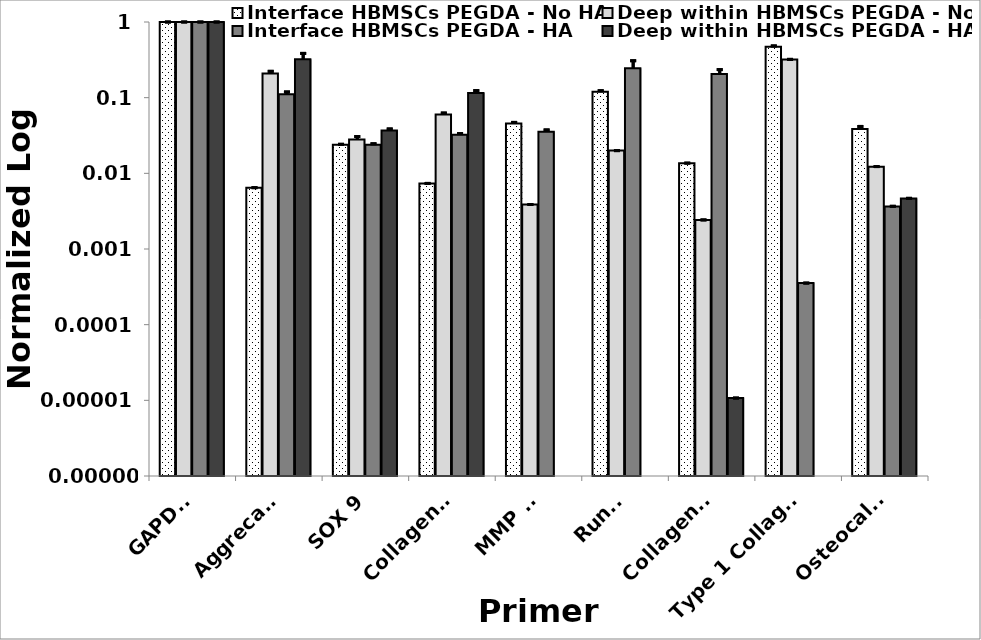
| Category | Interface HBMSCs PEGDA - No HA | Deep within HBMSCs PEGDA - No HA | Interface HBMSCs PEGDA - HA | Deep within HBMSCs PEGDA - HA |
|---|---|---|---|---|
| GAPDH | 1 | 1 | 1 | 1 |
| Aggrecan  | 0.006 | 0.209 | 0.111 | 0.321 |
| SOX 9 | 0.024 | 0.028 | 0.024 | 0.037 |
| Collagen II | 0.007 | 0.06 | 0.032 | 0.115 |
| MMP 13 | 0.045 | 0.004 | 0.035 | 0 |
| Runx2 | 0.12 | 0.02 | 0.245 | 0 |
| Collagen X | 0.014 | 0.002 | 0.206 | 0 |
| Type 1 Collagen | 0.471 | 0.321 | 0 | 0 |
| Osteocalcin | 0.038 | 0.012 | 0.004 | 0.005 |